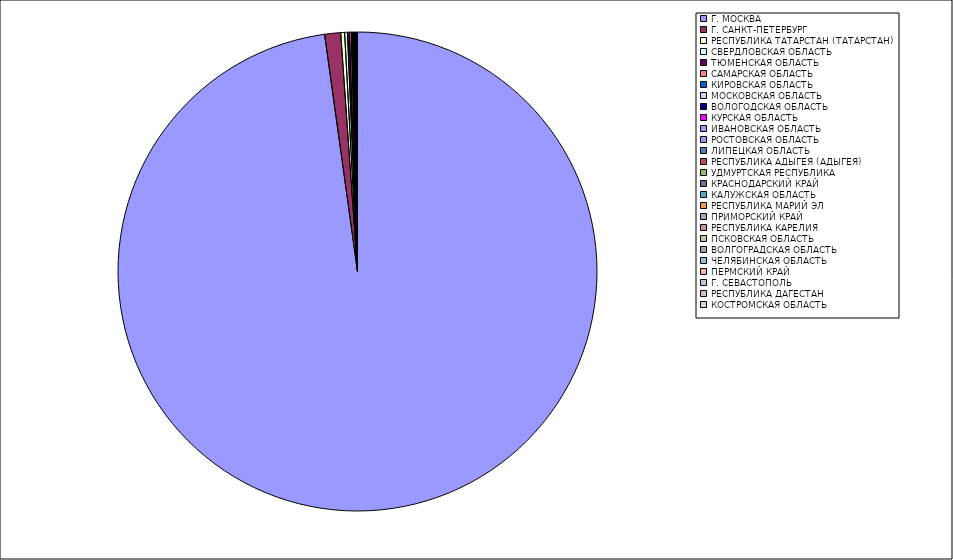
| Category | Оборот |
|---|---|
| Г. МОСКВА | 97.752 |
| Г. САНКТ-ПЕТЕРБУРГ | 1.075 |
| РЕСПУБЛИКА ТАТАРСТАН (ТАТАРСТАН) | 0.261 |
| СВЕРДЛОВСКАЯ ОБЛАСТЬ | 0.189 |
| ТЮМЕНСКАЯ ОБЛАСТЬ | 0.133 |
| САМАРСКАЯ ОБЛАСТЬ | 0.12 |
| КИРОВСКАЯ ОБЛАСТЬ | 0.073 |
| МОСКОВСКАЯ ОБЛАСТЬ | 0.049 |
| ВОЛОГОДСКАЯ ОБЛАСТЬ | 0.044 |
| КУРСКАЯ ОБЛАСТЬ | 0.029 |
| ИВАНОВСКАЯ ОБЛАСТЬ | 0.029 |
| РОСТОВСКАЯ ОБЛАСТЬ | 0.025 |
| ЛИПЕЦКАЯ ОБЛАСТЬ | 0.022 |
| РЕСПУБЛИКА АДЫГЕЯ (АДЫГЕЯ) | 0.018 |
| УДМУРТСКАЯ РЕСПУБЛИКА | 0.017 |
| КРАСНОДАРСКИЙ КРАЙ | 0.017 |
| КАЛУЖСКАЯ ОБЛАСТЬ | 0.017 |
| РЕСПУБЛИКА МАРИЙ ЭЛ | 0.011 |
| ПРИМОРСКИЙ КРАЙ | 0.009 |
| РЕСПУБЛИКА КАРЕЛИЯ | 0.009 |
| ПСКОВСКАЯ ОБЛАСТЬ | 0.008 |
| ВОЛГОГРАДСКАЯ ОБЛАСТЬ | 0.008 |
| ЧЕЛЯБИНСКАЯ ОБЛАСТЬ | 0.007 |
| ПЕРМСКИЙ КРАЙ | 0.006 |
| Г. СЕВАСТОПОЛЬ | 0.006 |
| РЕСПУБЛИКА ДАГЕСТАН | 0.006 |
| КОСТРОМСКАЯ ОБЛАСТЬ | 0.005 |